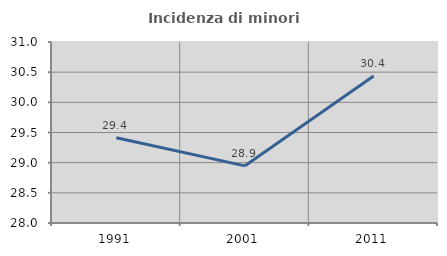
| Category | Incidenza di minori stranieri |
|---|---|
| 1991.0 | 29.412 |
| 2001.0 | 28.947 |
| 2011.0 | 30.435 |